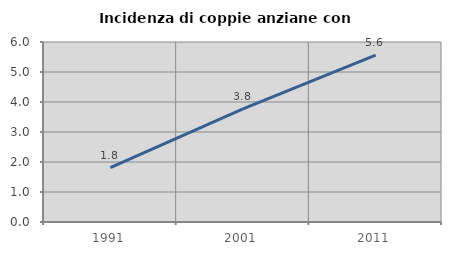
| Category | Incidenza di coppie anziane con figli |
|---|---|
| 1991.0 | 1.815 |
| 2001.0 | 3.774 |
| 2011.0 | 5.564 |